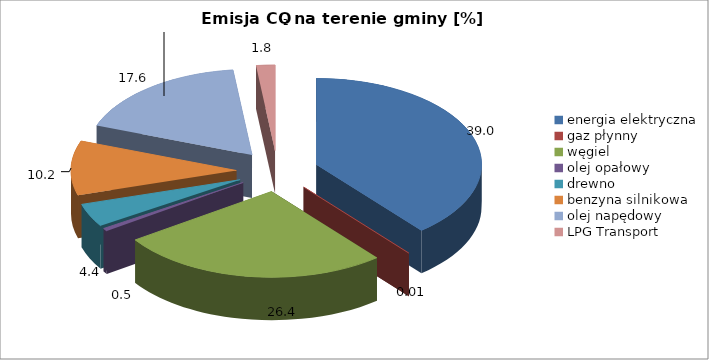
| Category | 39,0 0,01 26,4 0,5 4,4 10,2 17,6 1,8 |
|---|---|
| energia elektryczna | 39.015 |
| gaz płynny | 0.01 |
| węgiel | 26.417 |
| olej opałowy | 0.529 |
| drewno | 4.38 |
| benzyna silnikowa | 10.247 |
| olej napędowy | 17.56 |
| LPG Transport | 1.842 |